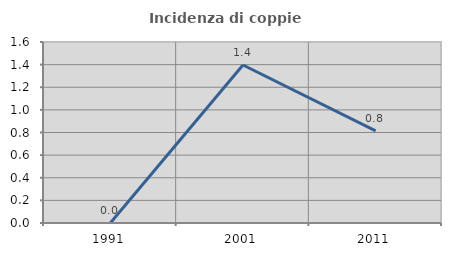
| Category | Incidenza di coppie miste |
|---|---|
| 1991.0 | 0 |
| 2001.0 | 1.397 |
| 2011.0 | 0.814 |